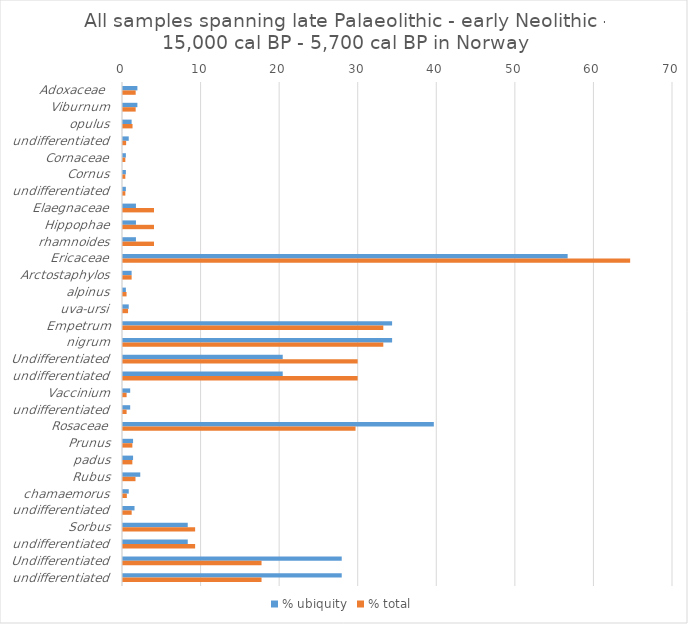
| Category | % ubiquity | % total |
|---|---|---|
| Adoxaceae  | 1.832 | 1.613 |
| Viburnum | 1.832 | 1.613 |
| opulus | 1.099 | 1.213 |
| undifferentiated | 0.733 | 0.4 |
| Cornaceae | 0.366 | 0.298 |
| Cornus | 0.366 | 0.298 |
| undifferentiated | 0.366 | 0.298 |
| Elaegnaceae | 1.648 | 3.945 |
| Hippophae | 1.648 | 3.945 |
| rhamnoides | 1.648 | 3.945 |
| Ericaceae | 56.593 | 64.548 |
| Arctostaphylos | 1.099 | 1.097 |
| alpinus | 0.366 | 0.453 |
| uva-ursi | 0.733 | 0.645 |
| Empetrum | 34.249 | 33.128 |
| nigrum | 34.249 | 33.128 |
| Undifferentiated | 20.33 | 29.863 |
| undifferentiated | 20.33 | 29.863 |
| Vaccinium | 0.916 | 0.459 |
| undifferentiated | 0.916 | 0.459 |
| Rosaceae | 39.56 | 29.596 |
| Prunus | 1.282 | 1.191 |
| padus | 1.282 | 1.191 |
| Rubus | 2.198 | 1.591 |
| chamaemorus | 0.733 | 0.487 |
| undifferentiated | 1.465 | 1.104 |
| Sorbus | 8.242 | 9.181 |
| undifferentiated | 8.242 | 9.181 |
| Undifferentiated | 27.839 | 17.633 |
| undifferentiated | 27.839 | 17.633 |